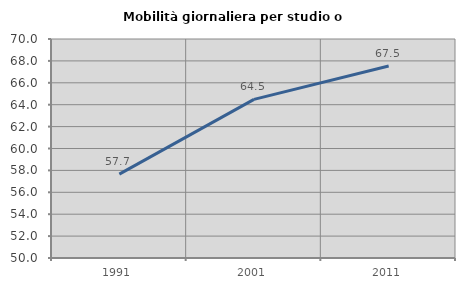
| Category | Mobilità giornaliera per studio o lavoro |
|---|---|
| 1991.0 | 57.655 |
| 2001.0 | 64.489 |
| 2011.0 | 67.532 |